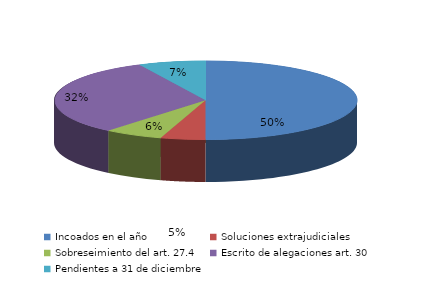
| Category | Series 0 |
|---|---|
| Incoados en el año | 231 |
| Soluciones extrajudiciales | 22 |
| Sobreseimiento del art. 27.4 | 29 |
| Escrito de alegaciones art. 30 | 147 |
| Pendientes a 31 de diciembre | 33 |